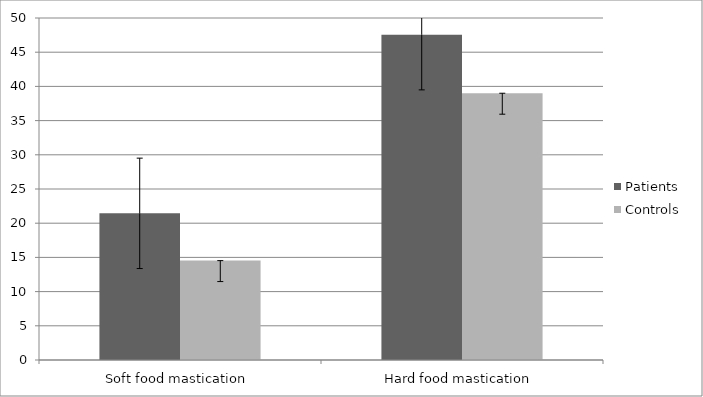
| Category | Patients  | Controls  |
|---|---|---|
| Soft food mastication  | 21.44 | 14.53 |
| Hard food mastication  | 47.56 | 39 |